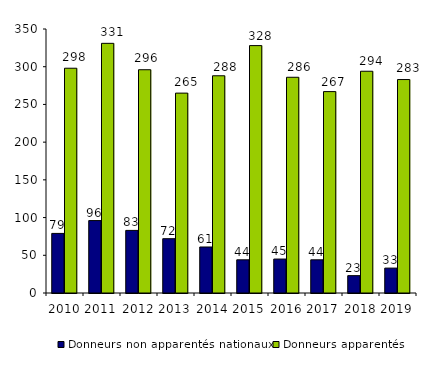
| Category | Donneurs non apparentés nationaux | Donneurs apparentés |
|---|---|---|
| 2010.0 | 79 | 298 |
| 2011.0 | 96 | 331 |
| 2012.0 | 83 | 296 |
| 2013.0 | 72 | 265 |
| 2014.0 | 61 | 288 |
| 2015.0 | 44 | 328 |
| 2016.0 | 45 | 286 |
| 2017.0 | 44 | 267 |
| 2018.0 | 23 | 294 |
| 2019.0 | 33 | 283 |